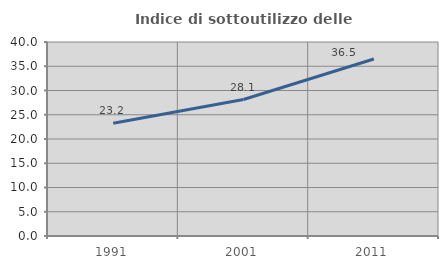
| Category | Indice di sottoutilizzo delle abitazioni  |
|---|---|
| 1991.0 | 23.24 |
| 2001.0 | 28.141 |
| 2011.0 | 36.485 |